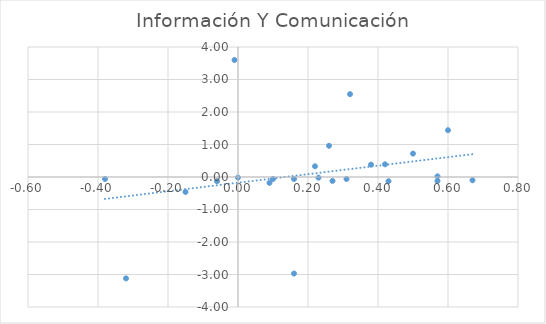
| Category | Información Y Comunicación |
|---|---|
| 0.38 | 0.38 |
| -0.15 | -0.46 |
| -0.06 | -0.13 |
| 0.32 | 2.55 |
| -0.01 | 3.6 |
| 0.0 | -0.02 |
| -0.38 | -0.06 |
| -0.32 | -3.12 |
| 0.16 | -2.97 |
| 0.57 | 0.02 |
| 0.67 | -0.1 |
| 0.42 | 0.39 |
| 0.26 | 0.96 |
| 0.1 | -0.06 |
| 0.16 | -0.06 |
| 0.23 | -0.02 |
| 0.09 | -0.18 |
| 0.22 | 0.33 |
| 0.27 | -0.12 |
| 0.31 | -0.06 |
| 0.5 | 0.72 |
| 0.43 | -0.13 |
| 0.57 | -0.12 |
| 0.6 | 1.44 |